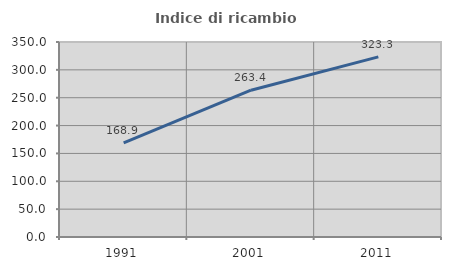
| Category | Indice di ricambio occupazionale  |
|---|---|
| 1991.0 | 168.868 |
| 2001.0 | 263.431 |
| 2011.0 | 323.333 |